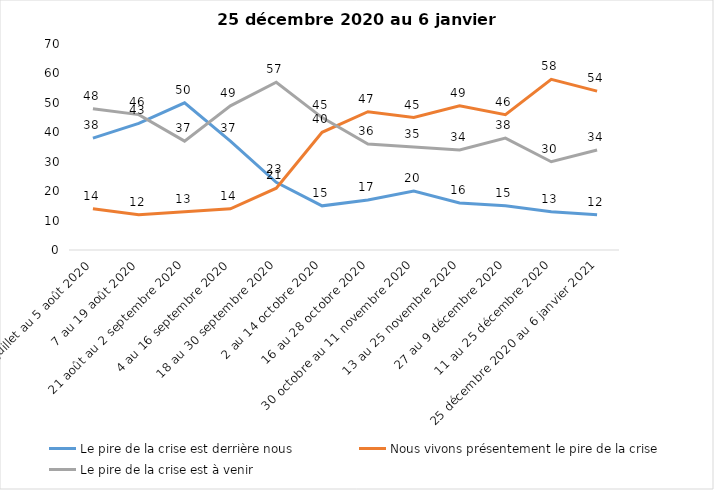
| Category | Le pire de la crise est derrière nous | Nous vivons présentement le pire de la crise | Le pire de la crise est à venir |
|---|---|---|---|
| 24 juillet au 5 août 2020 | 38 | 14 | 48 |
| 7 au 19 août 2020 | 43 | 12 | 46 |
| 21 août au 2 septembre 2020 | 50 | 13 | 37 |
| 4 au 16 septembre 2020 | 37 | 14 | 49 |
| 18 au 30 septembre 2020 | 23 | 21 | 57 |
| 2 au 14 octobre 2020 | 15 | 40 | 45 |
| 16 au 28 octobre 2020 | 17 | 47 | 36 |
| 30 octobre au 11 novembre 2020 | 20 | 45 | 35 |
| 13 au 25 novembre 2020 | 16 | 49 | 34 |
| 27 au 9 décembre 2020 | 15 | 46 | 38 |
| 11 au 25 décembre 2020 | 13 | 58 | 30 |
| 25 décembre 2020 au 6 janvier 2021 | 12 | 54 | 34 |